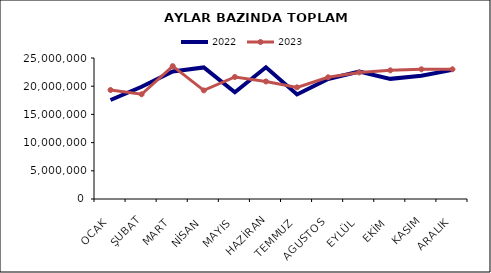
| Category | 2022 | 2023 |
|---|---|---|
| OCAK | 17553745.067 | 19324344.316 |
| ŞUBAT | 19904331.12 | 18570293.258 |
| MART | 22609642.478 | 23561564.76 |
| NİSAN | 23330991.125 | 19256618.86 |
| MAYIS | 18931811.633 | 21633834.051 |
| HAZİRAN | 23359482.376 | 20836974.291 |
| TEMMUZ | 18536547.531 | 19795531.607 |
| AGUSTOS | 21275849.662 | 21578961.686 |
| EYLÜL | 22596774.302 | 22441682.444 |
| EKİM | 21300785.132 | 22811866.119 |
| KASIM | 21871038.612 | 22998694.166 |
| ARALIK | 22898748.625 | 22998556.443 |